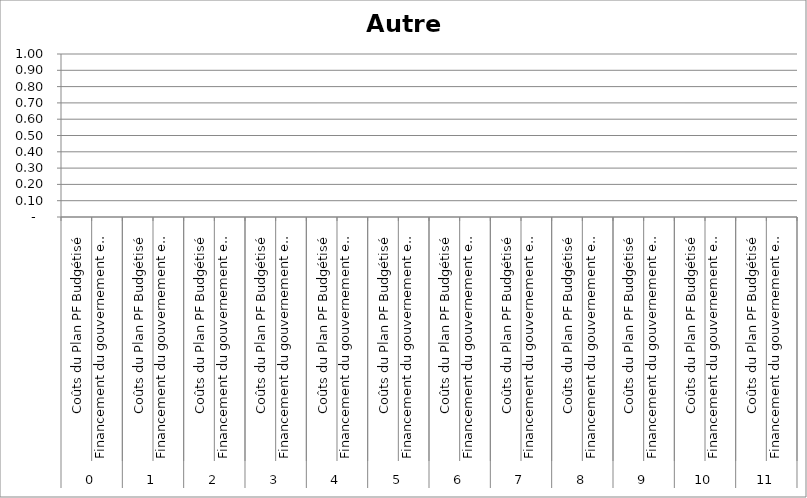
| Category | Autre 6 |
|---|---|
| 0 | 0 |
| 1 | 0 |
| 2 | 0 |
| 3 | 0 |
| 4 | 0 |
| 5 | 0 |
| 6 | 0 |
| 7 | 0 |
| 8 | 0 |
| 9 | 0 |
| 10 | 0 |
| 11 | 0 |
| 12 | 0 |
| 13 | 0 |
| 14 | 0 |
| 15 | 0 |
| 16 | 0 |
| 17 | 0 |
| 18 | 0 |
| 19 | 0 |
| 20 | 0 |
| 21 | 0 |
| 22 | 0 |
| 23 | 0 |